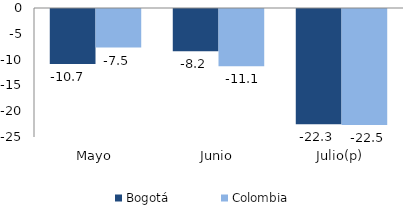
| Category | Bogotá | Colombia |
|---|---|---|
| Mayo | -10.677 | -7.477 |
| Junio | -8.165 | -11.077 |
| Julio(p) | -22.325 | -22.469 |